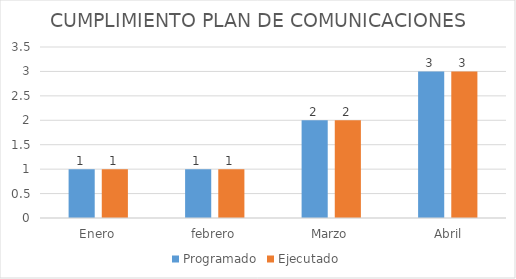
| Category | Programado | Ejecutado |
|---|---|---|
| Enero | 1 | 1 |
| febrero | 1 | 1 |
| Marzo | 2 | 2 |
|  Abril | 3 | 3 |